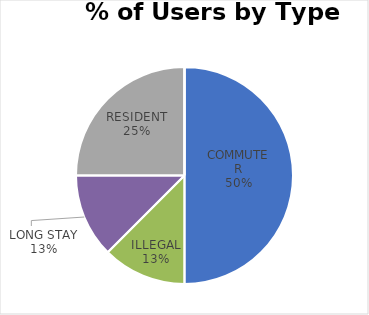
| Category | MANNING PLACE |
|---|---|
| COMMUTER | 4 |
| ILLEGAL | 1 |
| LONG STAY | 1 |
| RESIDENT | 2 |
| SHORT STAY | 0 |
| DISABLED | 0 |
| OTHER | 0 |